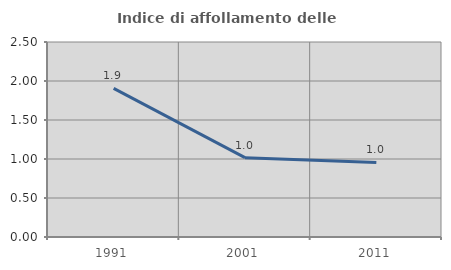
| Category | Indice di affollamento delle abitazioni  |
|---|---|
| 1991.0 | 1.906 |
| 2001.0 | 1.017 |
| 2011.0 | 0.956 |